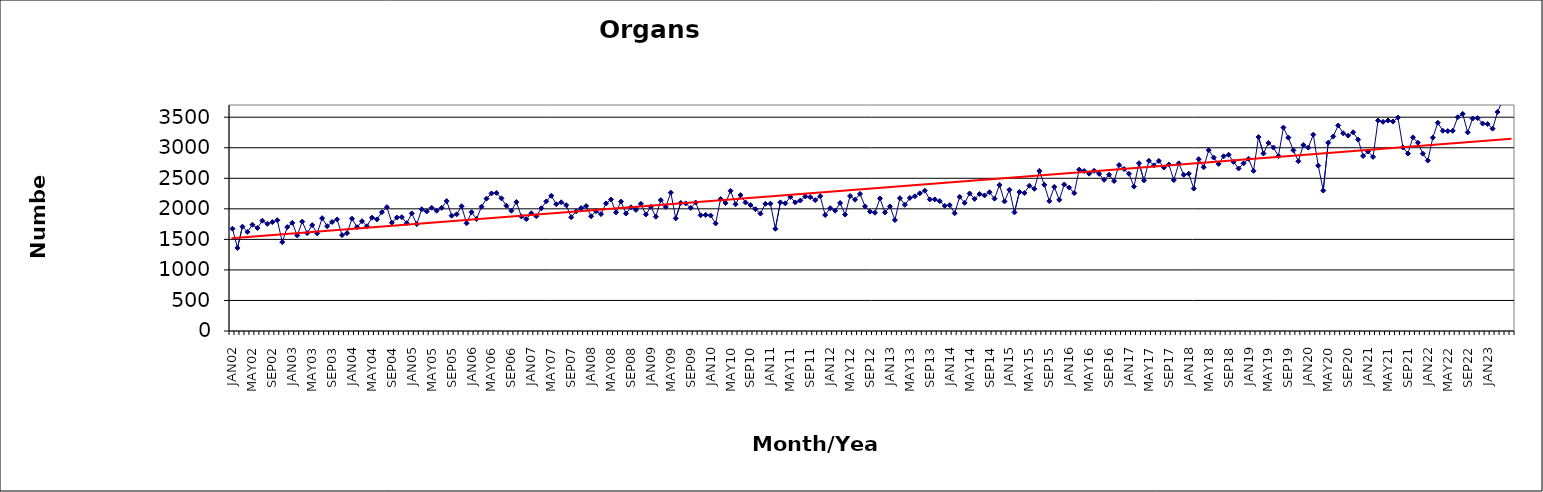
| Category | Series 0 |
|---|---|
| JAN02 | 1675 |
| FEB02 | 1360 |
| MAR02 | 1708 |
| APR02 | 1623 |
| MAY02 | 1740 |
| JUN02 | 1687 |
| JUL02 | 1806 |
| AUG02 | 1755 |
| SEP02 | 1783 |
| OCT02 | 1813 |
| NOV02 | 1455 |
| DEC02 | 1701 |
| JAN03 | 1770 |
| FEB03 | 1565 |
| MAR03 | 1791 |
| APR03 | 1603 |
| MAY03 | 1734 |
| JUN03 | 1598 |
| JUL03 | 1847 |
| AUG03 | 1716 |
| SEP03 | 1785 |
| OCT03 | 1827 |
| NOV03 | 1570 |
| DEC03 | 1602 |
| JAN04 | 1839 |
| FEB04 | 1700 |
| MAR04 | 1797 |
| APR04 | 1715 |
| MAY04 | 1855 |
| JUN04 | 1827 |
| JUL04 | 1945 |
| AUG04 | 2028 |
| SEP04 | 1773 |
| OCT04 | 1857 |
| NOV04 | 1864 |
| DEC04 | 1766 |
| JAN05 | 1925 |
| FEB05 | 1750 |
| MAR05 | 1993 |
| APR05 | 1957 |
| MAY05 | 2018 |
| JUN05 | 1969 |
| JUL05 | 2016 |
| AUG05 | 2127 |
| SEP05 | 1888 |
| OCT05 | 1910 |
| NOV05 | 2042 |
| DEC05 | 1764 |
| JAN06 | 1945 |
| FEB06 | 1834 |
| MAR06 | 2035 |
| APR06 | 2167 |
| MAY06 | 2252 |
| JUN06 | 2261 |
| JUL06 | 2172 |
| AUG06 | 2051 |
| SEP06 | 1969 |
| OCT06 | 2111 |
| NOV06 | 1875 |
| DEC06 | 1832 |
| JAN07 | 1927 |
| FEB07 | 1878 |
| MAR07 | 2009 |
| APR07 | 2122 |
| MAY07 | 2214 |
| JUN07 | 2076 |
| JUL07 | 2108 |
| AUG07 | 2060 |
| SEP07 | 1863 |
| OCT07 | 1959 |
| NOV07 | 2012 |
| DEC07 | 2046 |
| JAN08 | 1878 |
| FEB08 | 1962 |
| MAR08 | 1914 |
| APR08 | 2089 |
| MAY08 | 2153 |
| JUN08 | 1942 |
| JUL08 | 2119 |
| AUG08 | 1923 |
| SEP08 | 2026 |
| OCT08 | 1983 |
| NOV08 | 2082 |
| DEC08 | 1908 |
| JAN09 | 2033 |
| FEB09 | 1871 |
| MAR09 | 2143 |
| APR09 | 2032 |
| MAY09 | 2266 |
| JUN09 | 1844 |
| JUL09 | 2096 |
| AUG09 | 2089 |
| SEP09 | 2016 |
| OCT09 | 2104 |
| NOV09 | 1894 |
| DEC09 | 1901 |
| JAN10 | 1890 |
| FEB10 | 1761 |
| MAR10 | 2160 |
| APR10 | 2094 |
| MAY10 | 2295 |
| JUN10 | 2075 |
| JUL10 | 2226 |
| AUG10 | 2104 |
| SEP10 | 2062 |
| OCT10 | 1994 |
| NOV10 | 1922 |
| DEC10 | 2082 |
| JAN11 | 2085 |
| FEB11 | 1674 |
| MAR11 | 2106 |
| APR11 | 2090 |
| MAY11 | 2194 |
| JUN11 | 2105 |
| JUL11 | 2136 |
| AUG11 | 2202 |
| SEP11 | 2192 |
| OCT11 | 2142 |
| NOV11 | 2207 |
| DEC11 | 1899 |
| JAN12 | 2011 |
| FEB12 | 1970 |
| MAR12 | 2096 |
| APR12 | 1906 |
| MAY12 | 2210 |
| JUN12 | 2150 |
| JUL12 | 2244 |
| AUG12 | 2041 |
| SEP12 | 1954 |
| OCT12 | 1936 |
| NOV12 | 2170 |
| DEC12 | 1941 |
| JAN13 | 2039 |
| FEB13 | 1816 |
| MAR13 | 2175 |
| APR13 | 2065 |
| MAY13 | 2179 |
| JUN13 | 2205 |
| JUL13 | 2254 |
| AUG13 | 2297 |
| SEP13 | 2154 |
| OCT13 | 2154 |
| NOV13 | 2126 |
| DEC13 | 2049 |
| JAN14 | 2061 |
| FEB14 | 1927 |
| MAR14 | 2197 |
| APR14 | 2098 |
| MAY14 | 2251 |
| JUN14 | 2162 |
| JUL14 | 2243 |
| AUG14 | 2220 |
| SEP14 | 2272 |
| OCT14 | 2167 |
| NOV14 | 2391 |
| DEC14 | 2121 |
| JAN15 | 2312 |
| FEB15 | 1942 |
| MAR15 | 2275 |
| APR15 | 2259 |
| MAY15 | 2379 |
| JUN15 | 2328 |
| JUL15 | 2621 |
| AUG15 | 2393 |
| SEP15 | 2127 |
| OCT15 | 2359 |
| NOV15 | 2147 |
| DEC15 | 2398 |
| JAN16 | 2348 |
| FEB16 | 2258 |
| MAR16 | 2642 |
| APR16 | 2619 |
| MAY16 | 2576 |
| JUN16 | 2623 |
| JUL16 | 2573 |
| AUG16 | 2475 |
| SEP16 | 2559 |
| OCT16 | 2455 |
| NOV16 | 2717 |
| DEC16 | 2652 |
| JAN17 | 2574 |
| FEB17 | 2364 |
| MAR17 | 2747 |
| APR17 | 2466 |
| MAY17 | 2786 |
| JUN17 | 2712 |
| JUL17 | 2785 |
| AUG17 | 2676 |
| SEP17 | 2726 |
| OCT17 | 2470 |
| NOV17 | 2745 |
| DEC17 | 2557 |
| JAN18 | 2575 |
| FEB18 | 2331 |
| MAR18 | 2813 |
| APR18 | 2681 |
| MAY18 | 2960 |
| JUN18 | 2839 |
| JUL18 | 2735 |
| AUG18 | 2860 |
| SEP18 | 2886 |
| OCT18 | 2769 |
| NOV18 | 2661 |
| DEC18 | 2745 |
| JAN19 | 2819 |
| FEB19 | 2622 |
| MAR19 | 3175 |
| APR19 | 2906 |
| MAY19 | 3079 |
| JUN19 | 3004 |
| JUL19 | 2863 |
| AUG19 | 3330 |
| SEP19 | 3166 |
| OCT19 | 2958 |
| NOV19 | 2779 |
| DEC19 | 3045 |
| JAN20 | 3002 |
| FEB20 | 3214 |
| MAR20 | 2707 |
| APR20 | 2299 |
| MAY20 | 3082 |
| JUN20 | 3185 |
| JUL20 | 3365 |
| AUG20 | 3238 |
| SEP20 | 3199 |
| OCT20 | 3253 |
| NOV20 | 3133 |
| DEC20 | 2865 |
| JAN21 | 2939 |
| FEB21 | 2850 |
| MAR21 | 3446 |
| APR21 | 3424 |
| MAY21 | 3446 |
| JUN21 | 3429 |
| JUL21 | 3494 |
| AUG21 | 3006 |
| SEP21 | 2905 |
| OCT21 | 3170 |
| NOV21 | 3083 |
| DEC21 | 2903 |
| JAN22 | 2790 |
| FEB22 | 3166 |
| MAR22 | 3409 |
| APR22 | 3278 |
| MAY22 | 3273 |
| JUN22 | 3278 |
| JUL22 | 3499 |
| AUG22 | 3554 |
| SEP22 | 3252 |
| OCT22 | 3478 |
| NOV22 | 3485 |
| DEC22 | 3397 |
| JAN23 | 3388 |
| FEB23 | 3313 |
| MAR23 | 3585 |
| APR23 | 3773 |